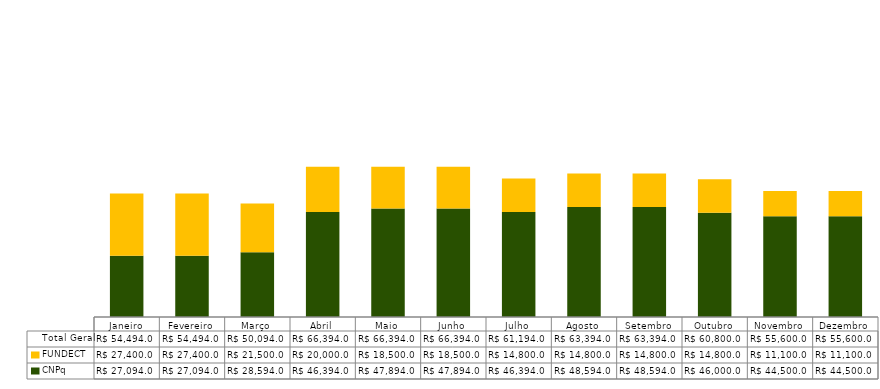
| Category | CNPq | FUNDECT | Total Geral |
|---|---|---|---|
| Janeiro | 27094 | 27400 | 54494 |
| Fevereiro | 27094 | 27400 | 54494 |
| Março | 28594 | 21500 | 50094 |
| Abril | 46394 | 20000 | 66394 |
| Maio | 47894 | 18500 | 66394 |
| Junho | 47894 | 18500 | 66394 |
| Julho | 46394 | 14800 | 61194 |
| Agosto | 48594 | 14800 | 63394 |
| Setembro | 48594 | 14800 | 63394 |
| Outubro | 46000 | 14800 | 60800 |
| Novembro | 44500 | 11100 | 55600 |
| Dezembro | 44500 | 11100 | 55600 |